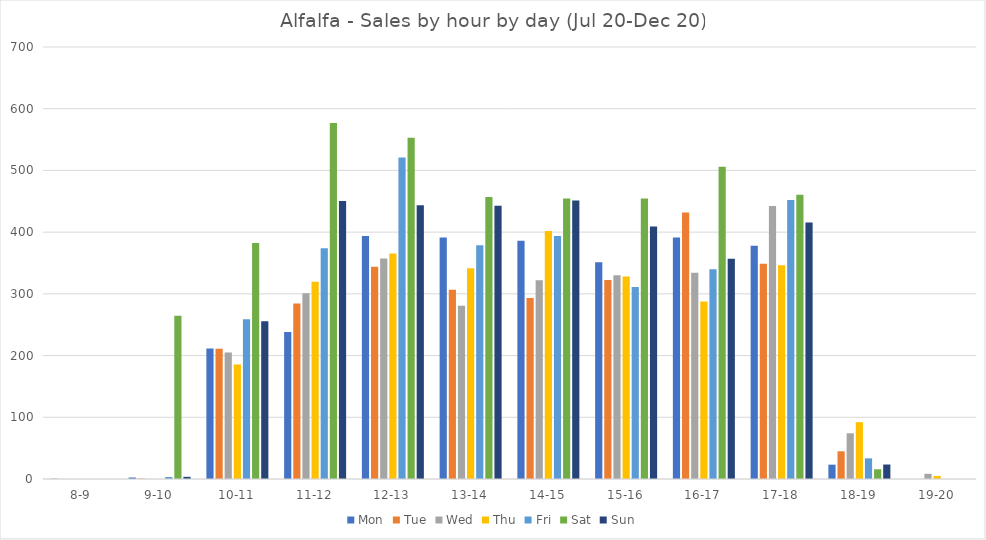
| Category | Mon | Tue | Wed | Thu | Fri | Sat | Sun |
|---|---|---|---|---|---|---|---|
| 8-9 | 0.422 | 0 | 0 | 0 | 0 | 0 | 0 |
| 9-10 | 2.423 | 0.686 | 0 | 0 | 3.278 | 264.677 | 3.515 |
| 10-11 | 211.307 | 210.9 | 205.01 | 185.558 | 259.017 | 382.224 | 255.661 |
| 11-12 | 238.153 | 284.385 | 301.138 | 319.597 | 373.886 | 576.863 | 450.485 |
| 12-13 | 393.839 | 343.844 | 357.35 | 365.489 | 520.817 | 552.832 | 443.397 |
| 13-14 | 391.163 | 306.705 | 280.565 | 341.408 | 378.737 | 456.859 | 442.627 |
| 14-15 | 386.018 | 293.164 | 322.093 | 401.816 | 393.8 | 454.396 | 451.177 |
| 15-16 | 351.319 | 322.645 | 330.106 | 328.31 | 311.138 | 454.66 | 409.312 |
| 16-17 | 391.505 | 431.741 | 334.101 | 287.641 | 340.043 | 506.062 | 356.887 |
| 17-18 | 378.123 | 348.813 | 442.161 | 346.309 | 451.955 | 460.485 | 415.604 |
| 18-19 | 23.23 | 44.907 | 74.095 | 92.039 | 33.445 | 15.743 | 23.471 |
| 19-20 | 0 | 0 | 8.419 | 4.946 | 0 | 0 | 0 |